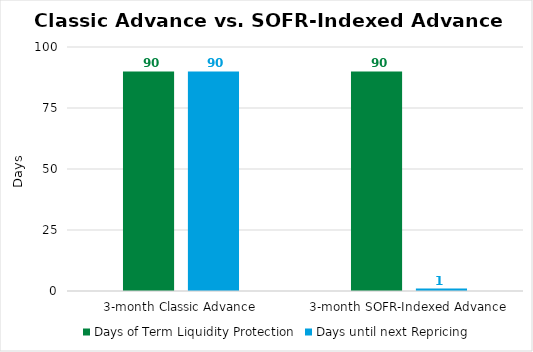
| Category | Days of Term Liquidity Protection | Days until next Repricing |
|---|---|---|
| 3-month Classic Advance | 90 | 90 |
| 3-month SOFR-Indexed Advance | 90 | 1 |